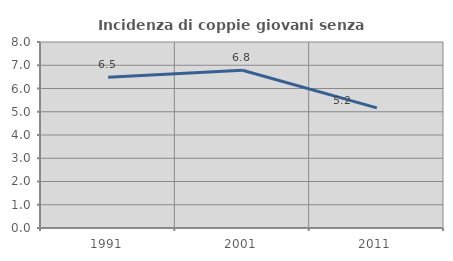
| Category | Incidenza di coppie giovani senza figli |
|---|---|
| 1991.0 | 6.48 |
| 2001.0 | 6.787 |
| 2011.0 | 5.165 |